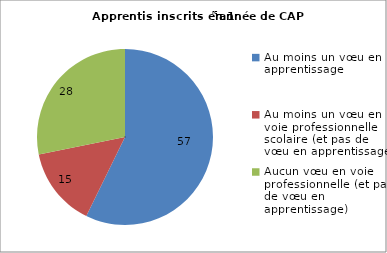
| Category | Series 0 |
|---|---|
| Au moins un vœu en apprentissage | 57.247 |
| Au moins un vœu en voie professionnelle scolaire (et pas de vœu en apprentissage) | 14.583 |
| Aucun vœu en voie professionnelle (et pas de vœu en apprentissage) | 28.17 |